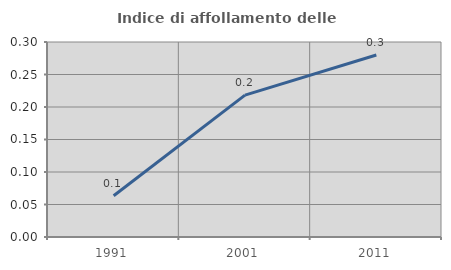
| Category | Indice di affollamento delle abitazioni  |
|---|---|
| 1991.0 | 0.063 |
| 2001.0 | 0.218 |
| 2011.0 | 0.28 |